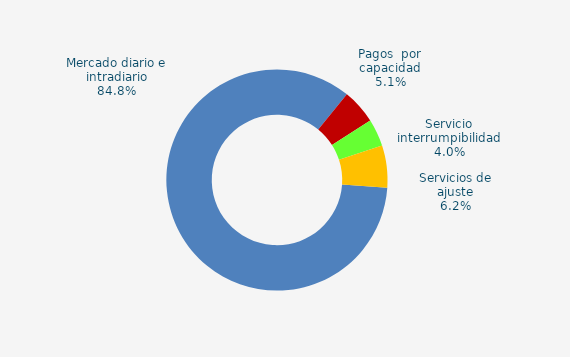
| Category | Series 0 |
|---|---|
| Mercado diario e intradiario | 43.94 |
| Pagos  por capacidad | 2.63 |
| Servicio interrumpibilidad | 2.07 |
| Servicios de ajuste | 3.19 |